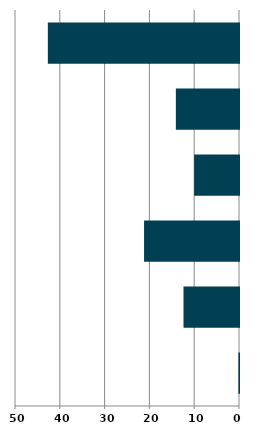
| Category | Series 0 |
|---|---|
| 0 | 0.13 |
| 1 | 12.388 |
| 2 | 21.192 |
| 3 | 10.019 |
| 4 | 14.096 |
| 5 | 42.672 |